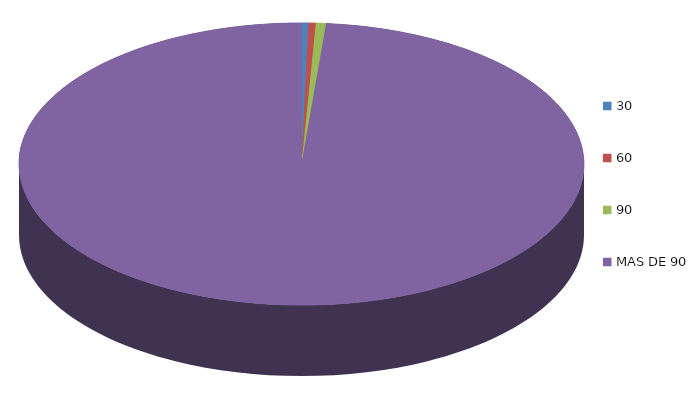
| Category | Series 0 | 162,831.2 |
|---|---|---|
| 0 | 162831.2 |  |
| 1 | 176677.5 |  |
| 2 | 242985.8 |  |
| 3 | 41390097.3 |  |